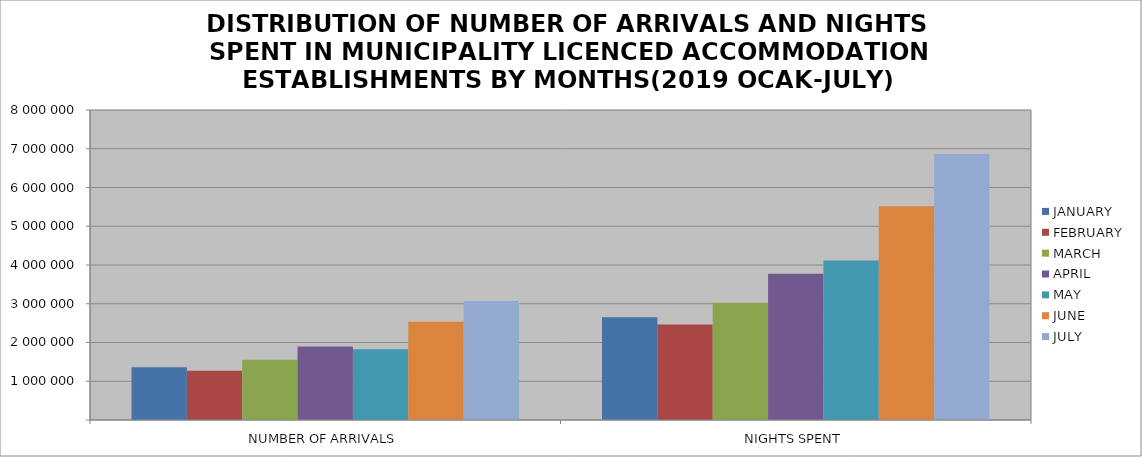
| Category | JANUARY | FEBRUARY | MARCH | APRIL | MAY | JUNE | JULY |
|---|---|---|---|---|---|---|---|
| NUMBER OF ARRIVALS | 1363187 | 1273727 | 1552518 | 1898202 | 1826154 | 2537491 | 3073499 |
| NIGHTS SPENT | 2649437 | 2462023 | 3024704 | 3772615 | 4117532 | 5513568 | 6866550 |